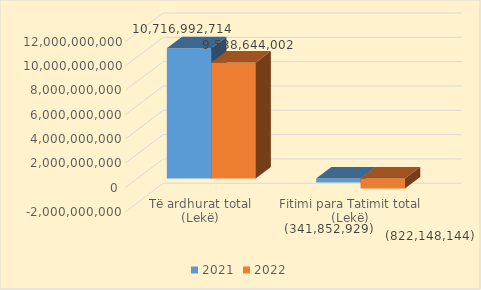
| Category | 2021 | 2022 |
|---|---|---|
| Të ardhurat total
(Lekë) | 10716992714 | 9538644002 |
| Fitimi para Tatimit total
(Lekë) | -341852929 | -822148144 |